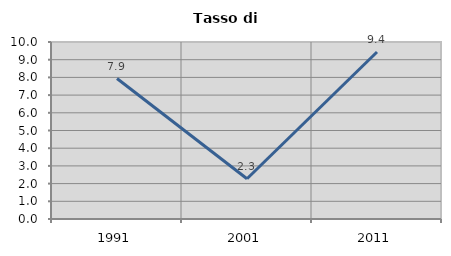
| Category | Tasso di disoccupazione   |
|---|---|
| 1991.0 | 7.937 |
| 2001.0 | 2.273 |
| 2011.0 | 9.434 |